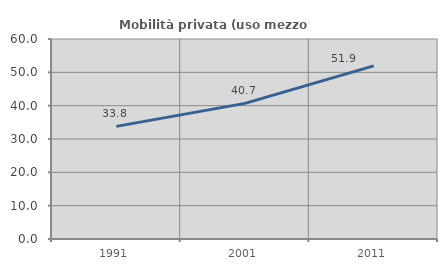
| Category | Mobilità privata (uso mezzo privato) |
|---|---|
| 1991.0 | 33.784 |
| 2001.0 | 40.691 |
| 2011.0 | 51.943 |